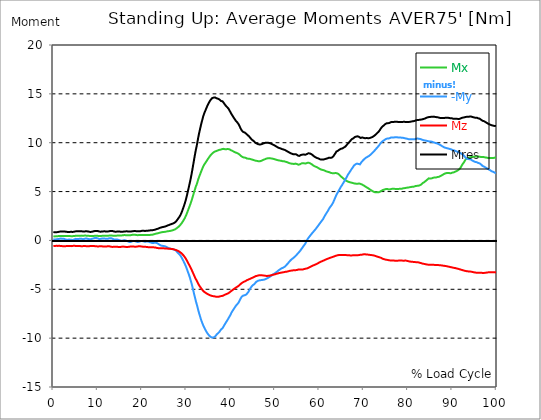
| Category |  Mx |  -My |  Mz |  Mres |
|---|---|---|---|---|
| 0.0 | 0.423 | 0.114 | -0.584 | 0.858 |
| 0.167348456675344 | 0.412 | 0.103 | -0.572 | 0.847 |
| 0.334696913350688 | 0.412 | 0.092 | -0.572 | 0.835 |
| 0.5020453700260321 | 0.412 | 0.103 | -0.561 | 0.835 |
| 0.669393826701376 | 0.423 | 0.114 | -0.549 | 0.835 |
| 0.83674228337672 | 0.435 | 0.137 | -0.549 | 0.847 |
| 1.0040907400520642 | 0.435 | 0.137 | -0.561 | 0.858 |
| 1.1621420602454444 | 0.446 | 0.137 | -0.549 | 0.87 |
| 1.3294905169207885 | 0.458 | 0.16 | -0.549 | 0.893 |
| 1.4968389735961325 | 0.458 | 0.172 | -0.561 | 0.904 |
| 1.6641874302714765 | 0.458 | 0.195 | -0.572 | 0.916 |
| 1.8315358869468206 | 0.458 | 0.183 | -0.584 | 0.927 |
| 1.9988843436221646 | 0.458 | 0.172 | -0.584 | 0.927 |
| 2.1662328002975086 | 0.458 | 0.172 | -0.584 | 0.927 |
| 2.333581256972853 | 0.458 | 0.172 | -0.584 | 0.916 |
| 2.5009297136481967 | 0.458 | 0.149 | -0.595 | 0.916 |
| 2.6682781703235405 | 0.446 | 0.114 | -0.595 | 0.904 |
| 2.8356266269988843 | 0.446 | 0.08 | -0.584 | 0.893 |
| 3.002975083674229 | 0.446 | 0.069 | -0.572 | 0.881 |
| 3.1703235403495724 | 0.446 | 0.069 | -0.561 | 0.87 |
| 3.337671997024917 | 0.446 | 0.08 | -0.561 | 0.858 |
| 3.4957233172182973 | 0.446 | 0.08 | -0.561 | 0.87 |
| 3.663071773893641 | 0.446 | 0.092 | -0.572 | 0.87 |
| 3.8304202305689854 | 0.446 | 0.08 | -0.584 | 0.881 |
| 3.997768687244329 | 0.435 | 0.069 | -0.584 | 0.881 |
| 4.165117143919673 | 0.435 | 0.046 | -0.572 | 0.881 |
| 4.332465600595017 | 0.435 | 0.046 | -0.561 | 0.87 |
| 4.499814057270361 | 0.446 | 0.057 | -0.549 | 0.881 |
| 4.667162513945706 | 0.458 | 0.092 | -0.549 | 0.893 |
| 4.834510970621049 | 0.469 | 0.137 | -0.549 | 0.916 |
| 5.001859427296393 | 0.469 | 0.16 | -0.561 | 0.927 |
| 5.169207883971737 | 0.469 | 0.16 | -0.572 | 0.938 |
| 5.336556340647081 | 0.469 | 0.149 | -0.584 | 0.938 |
| 5.503904797322425 | 0.469 | 0.149 | -0.584 | 0.938 |
| 5.671253253997769 | 0.469 | 0.137 | -0.572 | 0.927 |
| 5.82930457419115 | 0.469 | 0.149 | -0.572 | 0.916 |
| 5.996653030866494 | 0.481 | 0.183 | -0.572 | 0.927 |
| 6.164001487541838 | 0.492 | 0.195 | -0.584 | 0.938 |
| 6.331349944217181 | 0.492 | 0.172 | -0.595 | 0.938 |
| 6.498698400892526 | 0.481 | 0.137 | -0.595 | 0.927 |
| 6.66604685756787 | 0.481 | 0.126 | -0.584 | 0.916 |
| 6.833395314243213 | 0.481 | 0.137 | -0.572 | 0.916 |
| 7.000743770918558 | 0.492 | 0.16 | -0.572 | 0.916 |
| 7.168092227593902 | 0.492 | 0.195 | -0.572 | 0.927 |
| 7.335440684269246 | 0.492 | 0.206 | -0.584 | 0.938 |
| 7.50278914094459 | 0.492 | 0.206 | -0.595 | 0.938 |
| 7.6701375976199335 | 0.481 | 0.172 | -0.595 | 0.927 |
| 7.837486054295278 | 0.481 | 0.149 | -0.595 | 0.904 |
| 7.995537374488658 | 0.469 | 0.137 | -0.595 | 0.904 |
| 8.162885831164003 | 0.458 | 0.126 | -0.584 | 0.881 |
| 8.330234287839346 | 0.458 | 0.114 | -0.572 | 0.87 |
| 8.49758274451469 | 0.458 | 0.137 | -0.572 | 0.881 |
| 8.664931201190035 | 0.458 | 0.16 | -0.561 | 0.881 |
| 8.832279657865378 | 0.458 | 0.172 | -0.572 | 0.904 |
| 8.999628114540721 | 0.458 | 0.195 | -0.572 | 0.927 |
| 9.166976571216066 | 0.469 | 0.229 | -0.572 | 0.938 |
| 9.334325027891412 | 0.469 | 0.252 | -0.584 | 0.961 |
| 9.501673484566755 | 0.469 | 0.252 | -0.595 | 0.973 |
| 9.669021941242098 | 0.481 | 0.252 | -0.595 | 0.973 |
| 9.836370397917442 | 0.481 | 0.24 | -0.607 | 0.973 |
| 10.003718854592787 | 0.469 | 0.206 | -0.618 | 0.961 |
| 10.17106731126813 | 0.458 | 0.172 | -0.607 | 0.938 |
| 10.329118631461512 | 0.446 | 0.149 | -0.607 | 0.916 |
| 10.496467088136853 | 0.446 | 0.149 | -0.595 | 0.904 |
| 10.663815544812199 | 0.458 | 0.16 | -0.595 | 0.893 |
| 10.831164001487544 | 0.458 | 0.172 | -0.595 | 0.904 |
| 10.998512458162887 | 0.469 | 0.195 | -0.607 | 0.916 |
| 11.16586091483823 | 0.469 | 0.195 | -0.607 | 0.927 |
| 11.333209371513574 | 0.469 | 0.195 | -0.618 | 0.927 |
| 11.50055782818892 | 0.481 | 0.183 | -0.618 | 0.927 |
| 11.667906284864264 | 0.481 | 0.183 | -0.618 | 0.927 |
| 11.835254741539607 | 0.481 | 0.172 | -0.618 | 0.927 |
| 12.00260319821495 | 0.469 | 0.16 | -0.618 | 0.916 |
| 12.169951654890292 | 0.469 | 0.16 | -0.607 | 0.916 |
| 12.337300111565641 | 0.481 | 0.183 | -0.595 | 0.916 |
| 12.504648568240984 | 0.492 | 0.206 | -0.607 | 0.938 |
| 12.662699888434362 | 0.504 | 0.229 | -0.607 | 0.95 |
| 12.830048345109708 | 0.504 | 0.24 | -0.629 | 0.961 |
| 12.997396801785053 | 0.504 | 0.229 | -0.641 | 0.973 |
| 13.164745258460396 | 0.504 | 0.206 | -0.652 | 0.973 |
| 13.33209371513574 | 0.492 | 0.172 | -0.664 | 0.961 |
| 13.499442171811083 | 0.481 | 0.126 | -0.664 | 0.938 |
| 13.666790628486426 | 0.481 | 0.103 | -0.652 | 0.916 |
| 13.834139085161771 | 0.481 | 0.103 | -0.652 | 0.904 |
| 14.001487541837117 | 0.481 | 0.103 | -0.641 | 0.893 |
| 14.16883599851246 | 0.492 | 0.103 | -0.652 | 0.893 |
| 14.336184455187803 | 0.492 | 0.103 | -0.652 | 0.904 |
| 14.503532911863147 | 0.504 | 0.08 | -0.664 | 0.904 |
| 14.670881368538492 | 0.504 | 0.057 | -0.664 | 0.904 |
| 14.828932688731873 | 0.504 | 0.034 | -0.664 | 0.904 |
| 14.996281145407215 | 0.504 | 0.011 | -0.675 | 0.904 |
| 15.163629602082558 | 0.504 | -0.011 | -0.664 | 0.893 |
| 15.330978058757903 | 0.504 | -0.034 | -0.652 | 0.881 |
| 15.498326515433247 | 0.515 | -0.034 | -0.641 | 0.881 |
| 15.665674972108594 | 0.526 | -0.023 | -0.629 | 0.893 |
| 15.833023428783937 | 0.538 | 0 | -0.629 | 0.904 |
| 16.00037188545928 | 0.549 | 0.023 | -0.641 | 0.916 |
| 16.167720342134626 | 0.538 | 0.011 | -0.652 | 0.927 |
| 16.335068798809967 | 0.538 | -0.011 | -0.664 | 0.927 |
| 16.502417255485312 | 0.526 | -0.046 | -0.664 | 0.927 |
| 16.669765712160658 | 0.526 | -0.057 | -0.675 | 0.927 |
| 16.837114168836 | 0.526 | -0.103 | -0.664 | 0.927 |
| 17.004462625511344 | 0.526 | -0.137 | -0.652 | 0.916 |
| 17.16251394570472 | 0.526 | -0.16 | -0.641 | 0.916 |
| 17.32986240238007 | 0.526 | -0.172 | -0.629 | 0.916 |
| 17.497210859055414 | 0.538 | -0.149 | -0.618 | 0.916 |
| 17.664559315730756 | 0.561 | -0.114 | -0.618 | 0.927 |
| 17.8319077724061 | 0.572 | -0.08 | -0.618 | 0.938 |
| 17.999256229081443 | 0.584 | -0.046 | -0.618 | 0.95 |
| 18.166604685756788 | 0.584 | -0.046 | -0.629 | 0.95 |
| 18.333953142432133 | 0.584 | -0.057 | -0.641 | 0.961 |
| 18.501301599107478 | 0.572 | -0.08 | -0.641 | 0.961 |
| 18.668650055782823 | 0.561 | -0.114 | -0.641 | 0.95 |
| 18.835998512458165 | 0.549 | -0.137 | -0.629 | 0.938 |
| 19.00334696913351 | 0.538 | -0.16 | -0.618 | 0.927 |
| 19.170695425808855 | 0.538 | -0.16 | -0.595 | 0.927 |
| 19.338043882484197 | 0.549 | -0.137 | -0.595 | 0.927 |
| 19.496095202677576 | 0.549 | -0.103 | -0.595 | 0.938 |
| 19.66344365935292 | 0.561 | -0.069 | -0.607 | 0.95 |
| 19.830792116028263 | 0.561 | -0.046 | -0.618 | 0.961 |
| 19.998140572703612 | 0.561 | -0.057 | -0.629 | 0.984 |
| 20.165489029378953 | 0.561 | -0.069 | -0.652 | 0.984 |
| 20.3328374860543 | 0.549 | -0.092 | -0.652 | 0.984 |
| 20.500185942729644 | 0.549 | -0.114 | -0.652 | 0.973 |
| 20.667534399404985 | 0.549 | -0.137 | -0.652 | 0.973 |
| 20.83488285608033 | 0.549 | -0.126 | -0.652 | 0.973 |
| 21.002231312755672 | 0.561 | -0.114 | -0.664 | 0.984 |
| 21.16957976943102 | 0.561 | -0.103 | -0.675 | 0.996 |
| 21.336928226106362 | 0.561 | -0.103 | -0.687 | 0.996 |
| 21.504276682781704 | 0.561 | -0.126 | -0.698 | 1.007 |
| 21.67162513945705 | 0.561 | -0.16 | -0.698 | 1.019 |
| 21.82967645965043 | 0.572 | -0.183 | -0.71 | 1.041 |
| 21.997024916325774 | 0.572 | -0.217 | -0.71 | 1.041 |
| 22.16437337300112 | 0.572 | -0.24 | -0.71 | 1.041 |
| 22.33172182967646 | 0.584 | -0.263 | -0.698 | 1.041 |
| 22.499070286351806 | 0.607 | -0.252 | -0.71 | 1.053 |
| 22.666418743027148 | 0.629 | -0.252 | -0.71 | 1.076 |
| 22.833767199702496 | 0.652 | -0.24 | -0.71 | 1.099 |
| 23.00111565637784 | 0.675 | -0.24 | -0.721 | 1.11 |
| 23.168464113053183 | 0.698 | -0.24 | -0.744 | 1.133 |
| 23.335812569728528 | 0.71 | -0.263 | -0.767 | 1.167 |
| 23.50316102640387 | 0.732 | -0.298 | -0.778 | 1.19 |
| 23.670509483079215 | 0.744 | -0.355 | -0.79 | 1.213 |
| 23.83785793975456 | 0.767 | -0.423 | -0.801 | 1.247 |
| 23.995909259947936 | 0.79 | -0.458 | -0.801 | 1.282 |
| 24.163257716623285 | 0.813 | -0.504 | -0.813 | 1.316 |
| 24.330606173298627 | 0.824 | -0.526 | -0.813 | 1.328 |
| 24.49795462997397 | 0.835 | -0.538 | -0.813 | 1.35 |
| 24.665303086649313 | 0.858 | -0.561 | -0.813 | 1.373 |
| 24.83265154332466 | 0.858 | -0.572 | -0.813 | 1.385 |
| 25.0 | 0.87 | -0.584 | -0.813 | 1.396 |
| 25.167348456675345 | 0.881 | -0.607 | -0.824 | 1.419 |
| 25.334696913350694 | 0.893 | -0.629 | -0.824 | 1.442 |
| 25.502045370026035 | 0.916 | -0.687 | -0.835 | 1.488 |
| 25.669393826701377 | 0.927 | -0.71 | -0.835 | 1.511 |
| 25.836742283376722 | 0.938 | -0.744 | -0.847 | 1.545 |
| 26.004090740052067 | 0.95 | -0.778 | -0.847 | 1.568 |
| 26.17143919672741 | 0.961 | -0.801 | -0.858 | 1.602 |
| 26.329490516920792 | 0.973 | -0.835 | -0.858 | 1.625 |
| 26.49683897359613 | 0.996 | -0.858 | -0.87 | 1.648 |
| 26.66418743027148 | 1.007 | -0.87 | -0.87 | 1.682 |
| 26.831535886946828 | 1.03 | -0.881 | -0.881 | 1.705 |
| 26.998884343622166 | 1.053 | -0.904 | -0.893 | 1.728 |
| 27.166232800297514 | 1.076 | -0.927 | -0.916 | 1.762 |
| 27.333581256972852 | 1.11 | -0.95 | -0.938 | 1.808 |
| 27.5009297136482 | 1.133 | -0.973 | -0.95 | 1.854 |
| 27.668278170323543 | 1.19 | -1.041 | -0.984 | 1.934 |
| 27.835626626998888 | 1.259 | -1.133 | -1.019 | 2.037 |
| 28.002975083674233 | 1.316 | -1.225 | -1.041 | 2.14 |
| 28.170323540349575 | 1.373 | -1.305 | -1.087 | 2.243 |
| 28.33767199702492 | 1.431 | -1.373 | -1.122 | 2.335 |
| 28.50502045370026 | 1.511 | -1.465 | -1.167 | 2.461 |
| 28.663071773893645 | 1.602 | -1.556 | -1.225 | 2.598 |
| 28.830420230568986 | 1.682 | -1.671 | -1.293 | 2.758 |
| 28.99776868724433 | 1.797 | -1.808 | -1.362 | 2.941 |
| 29.165117143919673 | 1.911 | -1.957 | -1.453 | 3.159 |
| 29.33246560059502 | 2.037 | -2.094 | -1.522 | 3.365 |
| 29.499814057270367 | 2.163 | -2.255 | -1.614 | 3.582 |
| 29.66716251394571 | 2.3 | -2.415 | -1.717 | 3.822 |
| 29.834510970621054 | 2.461 | -2.586 | -1.831 | 4.074 |
| 30.00185942729639 | 2.632 | -2.781 | -1.968 | 4.372 |
| 30.169207883971744 | 2.815 | -2.976 | -2.094 | 4.669 |
| 30.33655634064708 | 3.021 | -3.204 | -2.255 | 5.013 |
| 30.50390479732243 | 3.227 | -3.399 | -2.392 | 5.333 |
| 30.671253253997772 | 3.422 | -3.616 | -2.529 | 5.677 |
| 30.829304574191156 | 3.628 | -3.845 | -2.678 | 6.008 |
| 30.996653030866494 | 3.834 | -4.131 | -2.827 | 6.386 |
| 31.164001487541842 | 4.063 | -4.383 | -2.987 | 6.764 |
| 31.331349944217187 | 4.303 | -4.681 | -3.147 | 7.176 |
| 31.498698400892525 | 4.566 | -5.001 | -3.319 | 7.622 |
| 31.666046857567874 | 4.818 | -5.322 | -3.491 | 8.057 |
| 31.833395314243212 | 5.081 | -5.642 | -3.662 | 8.503 |
| 32.00074377091856 | 5.31 | -5.94 | -3.834 | 8.915 |
| 32.1680922275939 | 5.551 | -6.26 | -3.983 | 9.327 |
| 32.33544068426925 | 5.722 | -6.512 | -4.109 | 9.659 |
| 32.50278914094459 | 5.974 | -6.798 | -4.257 | 10.071 |
| 32.670137597619934 | 6.226 | -7.096 | -4.418 | 10.483 |
| 32.83748605429528 | 6.443 | -7.382 | -4.555 | 10.872 |
| 33.004834510970625 | 6.649 | -7.634 | -4.681 | 11.216 |
| 33.162885831164004 | 6.844 | -7.885 | -4.784 | 11.548 |
| 33.33023428783935 | 7.05 | -8.137 | -4.898 | 11.879 |
| 33.497582744514695 | 7.222 | -8.332 | -4.99 | 12.166 |
| 33.664931201190036 | 7.416 | -8.538 | -5.093 | 12.463 |
| 33.83227965786538 | 7.599 | -8.721 | -5.184 | 12.738 |
| 33.99962811454073 | 7.737 | -8.881 | -5.253 | 12.967 |
| 34.16697657121607 | 7.851 | -9.041 | -5.31 | 13.15 |
| 34.33432502789141 | 7.965 | -9.179 | -5.356 | 13.333 |
| 34.50167348456676 | 8.08 | -9.316 | -5.402 | 13.516 |
| 34.6690219412421 | 8.194 | -9.442 | -5.459 | 13.699 |
| 34.83637039791744 | 8.32 | -9.556 | -5.493 | 13.859 |
| 35.00371885459279 | 8.423 | -9.659 | -5.539 | 14.02 |
| 35.17106731126814 | 8.538 | -9.751 | -5.574 | 14.157 |
| 35.338415767943474 | 8.641 | -9.819 | -5.608 | 14.283 |
| 35.49646708813686 | 8.732 | -9.877 | -5.642 | 14.397 |
| 35.6638155448122 | 8.824 | -9.922 | -5.665 | 14.489 |
| 35.831164001487544 | 8.904 | -9.945 | -5.688 | 14.569 |
| 35.998512458162885 | 8.961 | -9.945 | -5.699 | 14.603 |
| 36.165860914838234 | 9.018 | -9.911 | -5.711 | 14.615 |
| 36.333209371513576 | 9.076 | -9.888 | -5.722 | 14.638 |
| 36.50055782818892 | 9.11 | -9.831 | -5.722 | 14.626 |
| 36.667906284864266 | 9.133 | -9.739 | -5.757 | 14.592 |
| 36.83525474153961 | 9.156 | -9.625 | -5.768 | 14.546 |
| 37.002603198214956 | 9.19 | -9.545 | -5.768 | 14.512 |
| 37.1699516548903 | 9.224 | -9.488 | -5.768 | 14.5 |
| 37.337300111565646 | 9.259 | -9.407 | -5.757 | 14.466 |
| 37.50464856824098 | 9.282 | -9.327 | -5.745 | 14.42 |
| 37.66269988843437 | 9.282 | -9.213 | -5.711 | 14.329 |
| 37.83004834510971 | 9.304 | -9.11 | -5.688 | 14.271 |
| 37.99739680178505 | 9.339 | -9.041 | -5.688 | 14.26 |
| 38.16474525846039 | 9.373 | -8.984 | -5.665 | 14.237 |
| 38.33209371513574 | 9.373 | -8.892 | -5.642 | 14.168 |
| 38.49944217181109 | 9.35 | -8.721 | -5.596 | 14.031 |
| 38.666790628486424 | 9.339 | -8.595 | -5.562 | 13.928 |
| 38.83413908516178 | 9.339 | -8.469 | -5.528 | 13.825 |
| 39.001487541837115 | 9.339 | -8.343 | -5.493 | 13.733 |
| 39.16883599851246 | 9.35 | -8.229 | -5.459 | 13.653 |
| 39.336184455187805 | 9.35 | -8.103 | -5.436 | 13.573 |
| 39.503532911863154 | 9.362 | -7.977 | -5.402 | 13.493 |
| 39.670881368538495 | 9.339 | -7.84 | -5.345 | 13.367 |
| 39.83822982521384 | 9.282 | -7.714 | -5.276 | 13.218 |
| 39.996281145407224 | 9.247 | -7.565 | -5.219 | 13.081 |
| 40.163629602082565 | 9.213 | -7.405 | -5.161 | 12.944 |
| 40.33097805875791 | 9.179 | -7.279 | -5.104 | 12.818 |
| 40.498326515433256 | 9.144 | -7.153 | -5.047 | 12.703 |
| 40.6656749721086 | 9.098 | -7.038 | -4.99 | 12.578 |
| 40.83302342878393 | 9.064 | -6.924 | -4.944 | 12.463 |
| 41.00037188545929 | 9.018 | -6.81 | -4.887 | 12.349 |
| 41.16772034213463 | 8.984 | -6.695 | -4.841 | 12.246 |
| 41.33506879880997 | 8.961 | -6.604 | -4.784 | 12.154 |
| 41.50241725548531 | 8.927 | -6.523 | -4.738 | 12.074 |
| 41.66976571216066 | 8.892 | -6.443 | -4.692 | 11.982 |
| 41.837114168836 | 8.858 | -6.329 | -4.635 | 11.868 |
| 42.004462625511344 | 8.789 | -6.157 | -4.566 | 11.696 |
| 42.17181108218669 | 8.721 | -6.008 | -4.486 | 11.536 |
| 42.32986240238007 | 8.641 | -5.883 | -4.418 | 11.387 |
| 42.497210859055414 | 8.572 | -5.757 | -4.349 | 11.25 |
| 42.66455931573076 | 8.538 | -5.711 | -4.315 | 11.193 |
| 42.831907772406105 | 8.492 | -5.642 | -4.257 | 11.101 |
| 42.999256229081446 | 8.48 | -5.608 | -4.223 | 11.055 |
| 43.16660468575679 | 8.48 | -5.608 | -4.189 | 11.044 |
| 43.33395314243214 | 8.469 | -5.596 | -4.166 | 11.021 |
| 43.50130159910748 | 8.4 | -5.539 | -4.097 | 10.918 |
| 43.66865005578282 | 8.377 | -5.459 | -4.063 | 10.838 |
| 43.83599851245817 | 8.366 | -5.368 | -4.028 | 10.781 |
| 44.00334696913351 | 8.366 | -5.264 | -4.006 | 10.724 |
| 44.17069542580886 | 8.366 | -5.127 | -3.983 | 10.643 |
| 44.3380438824842 | 8.343 | -4.99 | -3.937 | 10.54 |
| 44.49609520267758 | 8.32 | -4.852 | -3.903 | 10.449 |
| 44.66344365935292 | 8.297 | -4.749 | -3.868 | 10.369 |
| 44.83079211602827 | 8.274 | -4.658 | -3.834 | 10.3 |
| 44.99814057270361 | 8.252 | -4.578 | -3.8 | 10.231 |
| 45.16548902937895 | 8.217 | -4.509 | -3.765 | 10.163 |
| 45.332837486054295 | 8.206 | -4.475 | -3.731 | 10.117 |
| 45.500185942729644 | 8.149 | -4.372 | -3.674 | 10.014 |
| 45.66753439940499 | 8.149 | -4.28 | -3.651 | 9.968 |
| 45.83488285608033 | 8.137 | -4.212 | -3.628 | 9.934 |
| 46.00223131275568 | 8.137 | -4.154 | -3.616 | 9.888 |
| 46.16957976943102 | 8.103 | -4.131 | -3.594 | 9.854 |
| 46.336928226106366 | 8.091 | -4.097 | -3.571 | 9.831 |
| 46.50427668278171 | 8.103 | -4.086 | -3.559 | 9.819 |
| 46.671625139457056 | 8.114 | -4.074 | -3.559 | 9.831 |
| 46.829676459650436 | 8.126 | -4.063 | -3.559 | 9.831 |
| 46.99702491632577 | 8.16 | -4.051 | -3.571 | 9.865 |
| 47.16437337300112 | 8.194 | -4.04 | -3.571 | 9.888 |
| 47.33172182967646 | 8.24 | -4.028 | -3.582 | 9.922 |
| 47.49907028635181 | 8.263 | -4.017 | -3.594 | 9.945 |
| 47.66641874302716 | 8.297 | -3.994 | -3.605 | 9.968 |
| 47.83376719970249 | 8.343 | -3.971 | -3.616 | 9.991 |
| 48.001115656377834 | 8.366 | -3.937 | -3.628 | 10.003 |
| 48.16846411305319 | 8.389 | -3.891 | -3.628 | 10.003 |
| 48.33581256972853 | 8.4 | -3.845 | -3.628 | 9.991 |
| 48.50316102640387 | 8.412 | -3.811 | -3.616 | 9.991 |
| 48.67050948307921 | 8.423 | -3.765 | -3.616 | 9.98 |
| 48.837857939754564 | 8.423 | -3.719 | -3.605 | 9.957 |
| 49.005206396429905 | 8.4 | -3.674 | -3.582 | 9.922 |
| 49.163257716623285 | 8.389 | -3.616 | -3.559 | 9.888 |
| 49.33060617329863 | 8.377 | -3.548 | -3.536 | 9.842 |
| 49.49795462997397 | 8.366 | -3.491 | -3.525 | 9.808 |
| 49.66530308664932 | 8.343 | -3.445 | -3.502 | 9.774 |
| 49.832651543324666 | 8.32 | -3.41 | -3.479 | 9.739 |
| 50.0 | 8.297 | -3.353 | -3.468 | 9.694 |
| 50.16734845667534 | 8.274 | -3.296 | -3.445 | 9.648 |
| 50.33469691335069 | 8.252 | -3.25 | -3.41 | 9.602 |
| 50.50204537002604 | 8.229 | -3.182 | -3.399 | 9.556 |
| 50.66939382670139 | 8.206 | -3.113 | -3.376 | 9.51 |
| 50.836742283376715 | 8.183 | -3.056 | -3.353 | 9.476 |
| 51.00409074005207 | 8.171 | -2.998 | -3.33 | 9.442 |
| 51.17143919672741 | 8.171 | -2.953 | -3.319 | 9.43 |
| 51.32949051692079 | 8.16 | -2.907 | -3.307 | 9.396 |
| 51.496838973596134 | 8.137 | -2.85 | -3.285 | 9.362 |
| 51.66418743027148 | 8.114 | -2.804 | -3.273 | 9.339 |
| 51.831535886946824 | 8.103 | -2.792 | -3.262 | 9.316 |
| 51.99888434362217 | 8.114 | -2.747 | -3.25 | 9.304 |
| 52.16623280029752 | 8.091 | -2.701 | -3.239 | 9.27 |
| 52.33358125697285 | 8.057 | -2.632 | -3.216 | 9.213 |
| 52.5009297136482 | 8.046 | -2.552 | -3.204 | 9.19 |
| 52.668278170323546 | 8.023 | -2.461 | -3.193 | 9.156 |
| 52.835626626998895 | 7.988 | -2.392 | -3.182 | 9.098 |
| 53.00297508367424 | 7.954 | -2.3 | -3.159 | 9.053 |
| 53.17032354034958 | 7.931 | -2.209 | -3.136 | 9.018 |
| 53.33767199702492 | 7.897 | -2.117 | -3.113 | 8.961 |
| 53.50502045370027 | 7.874 | -2.037 | -3.101 | 8.927 |
| 53.663071773893655 | 7.862 | -1.968 | -3.09 | 8.892 |
| 53.83042023056899 | 7.851 | -1.9 | -3.079 | 8.87 |
| 53.99776868724433 | 7.84 | -1.831 | -3.067 | 8.847 |
| 54.16511714391967 | 7.817 | -1.785 | -3.056 | 8.812 |
| 54.33246560059503 | 7.828 | -1.728 | -3.044 | 8.812 |
| 54.49981405727037 | 7.851 | -1.648 | -3.044 | 8.824 |
| 54.667162513945705 | 7.862 | -1.579 | -3.044 | 8.824 |
| 54.834510970621054 | 7.84 | -1.499 | -3.033 | 8.801 |
| 55.0018594272964 | 7.805 | -1.408 | -3.021 | 8.744 |
| 55.169207883971744 | 7.771 | -1.328 | -2.998 | 8.686 |
| 55.336556340647086 | 7.748 | -1.247 | -2.964 | 8.652 |
| 55.50390479732243 | 7.759 | -1.156 | -2.964 | 8.652 |
| 55.671253253997776 | 7.805 | -1.064 | -2.964 | 8.686 |
| 55.83860171067312 | 7.851 | -0.973 | -2.976 | 8.744 |
| 55.9966530308665 | 7.885 | -0.858 | -2.976 | 8.778 |
| 56.16400148754184 | 7.897 | -0.755 | -2.976 | 8.778 |
| 56.33134994421718 | 7.908 | -0.641 | -2.964 | 8.801 |
| 56.498698400892536 | 7.908 | -0.538 | -2.941 | 8.801 |
| 56.66604685756788 | 7.885 | -0.435 | -2.918 | 8.778 |
| 56.83339531424321 | 7.874 | -0.332 | -2.907 | 8.767 |
| 57.00074377091856 | 7.885 | -0.183 | -2.884 | 8.801 |
| 57.16809222759391 | 7.908 | -0.034 | -2.861 | 8.835 |
| 57.33544068426925 | 7.943 | 0.114 | -2.85 | 8.892 |
| 57.5027891409446 | 7.943 | 0.229 | -2.815 | 8.915 |
| 57.670137597619934 | 7.943 | 0.332 | -2.77 | 8.915 |
| 57.83748605429528 | 7.908 | 0.423 | -2.747 | 8.904 |
| 58.004834510970625 | 7.874 | 0.526 | -2.701 | 8.87 |
| 58.16288583116401 | 7.828 | 0.629 | -2.655 | 8.835 |
| 58.330234287839346 | 7.782 | 0.71 | -2.621 | 8.778 |
| 58.497582744514695 | 7.725 | 0.801 | -2.586 | 8.732 |
| 58.66493120119004 | 7.656 | 0.893 | -2.552 | 8.652 |
| 58.832279657865385 | 7.611 | 0.984 | -2.506 | 8.595 |
| 58.999628114540734 | 7.576 | 1.064 | -2.483 | 8.549 |
| 59.16697657121607 | 7.542 | 1.156 | -2.449 | 8.503 |
| 59.33432502789142 | 7.519 | 1.247 | -2.426 | 8.469 |
| 59.50167348456676 | 7.485 | 1.362 | -2.392 | 8.435 |
| 59.66902194124211 | 7.439 | 1.465 | -2.346 | 8.412 |
| 59.83637039791745 | 7.393 | 1.568 | -2.3 | 8.377 |
| 60.00371885459278 | 7.347 | 1.671 | -2.255 | 8.332 |
| 60.17106731126813 | 7.313 | 1.762 | -2.22 | 8.297 |
| 60.33841576794349 | 7.267 | 1.877 | -2.174 | 8.263 |
| 60.49646708813685 | 7.244 | 1.98 | -2.14 | 8.274 |
| 60.6638155448122 | 7.222 | 2.071 | -2.117 | 8.274 |
| 60.831164001487544 | 7.21 | 2.174 | -2.083 | 8.274 |
| 60.99851245816289 | 7.187 | 2.312 | -2.049 | 8.297 |
| 61.16586091483824 | 7.153 | 2.461 | -2.014 | 8.309 |
| 61.333209371513576 | 7.119 | 2.598 | -1.98 | 8.332 |
| 61.50055782818892 | 7.073 | 2.712 | -1.946 | 8.355 |
| 61.667906284864266 | 7.05 | 2.838 | -1.911 | 8.389 |
| 61.835254741539615 | 7.038 | 2.953 | -1.877 | 8.4 |
| 62.002603198214956 | 7.016 | 3.067 | -1.854 | 8.423 |
| 62.16995165489029 | 6.993 | 3.216 | -1.831 | 8.469 |
| 62.33730011156564 | 6.97 | 3.353 | -1.797 | 8.492 |
| 62.504648568240995 | 6.913 | 3.445 | -1.762 | 8.446 |
| 62.67199702491633 | 6.901 | 3.548 | -1.74 | 8.458 |
| 62.83004834510971 | 6.878 | 3.651 | -1.717 | 8.48 |
| 62.99739680178505 | 6.878 | 3.788 | -1.694 | 8.538 |
| 63.1647452584604 | 6.867 | 3.937 | -1.659 | 8.606 |
| 63.33209371513575 | 6.878 | 4.109 | -1.637 | 8.721 |
| 63.4994421718111 | 6.89 | 4.28 | -1.602 | 8.835 |
| 63.666790628486424 | 6.901 | 4.463 | -1.579 | 8.95 |
| 63.83413908516177 | 6.901 | 4.646 | -1.556 | 9.087 |
| 64.00148754183712 | 6.867 | 4.784 | -1.534 | 9.133 |
| 64.16883599851248 | 6.832 | 4.91 | -1.511 | 9.167 |
| 64.3361844551878 | 6.798 | 5.047 | -1.499 | 9.236 |
| 64.50353291186315 | 6.729 | 5.184 | -1.499 | 9.282 |
| 64.6708813685385 | 6.638 | 5.322 | -1.488 | 9.304 |
| 64.83822982521384 | 6.569 | 5.471 | -1.488 | 9.373 |
| 65.00557828188919 | 6.501 | 5.574 | -1.488 | 9.385 |
| 65.16362960208257 | 6.42 | 5.688 | -1.488 | 9.407 |
| 65.3309780587579 | 6.375 | 5.825 | -1.488 | 9.453 |
| 65.49832651543326 | 6.317 | 5.94 | -1.499 | 9.499 |
| 65.6656749721086 | 6.249 | 6.077 | -1.499 | 9.533 |
| 65.83302342878395 | 6.192 | 6.203 | -1.499 | 9.591 |
| 66.00037188545929 | 6.123 | 6.34 | -1.499 | 9.671 |
| 66.16772034213463 | 6.077 | 6.466 | -1.511 | 9.751 |
| 66.33506879880998 | 6.043 | 6.638 | -1.511 | 9.865 |
| 66.50241725548531 | 6.02 | 6.764 | -1.522 | 9.945 |
| 66.66976571216065 | 5.986 | 6.867 | -1.522 | 10.014 |
| 66.83711416883601 | 5.963 | 6.993 | -1.534 | 10.094 |
| 67.00446262551135 | 5.94 | 7.107 | -1.534 | 10.197 |
| 67.1718110821867 | 5.928 | 7.222 | -1.534 | 10.289 |
| 67.32986240238007 | 5.905 | 7.336 | -1.534 | 10.369 |
| 67.49721085905541 | 5.883 | 7.428 | -1.522 | 10.392 |
| 67.66455931573076 | 5.86 | 7.553 | -1.522 | 10.449 |
| 67.83190777240611 | 5.837 | 7.668 | -1.522 | 10.506 |
| 67.99925622908145 | 5.825 | 7.748 | -1.522 | 10.575 |
| 68.16660468575678 | 5.814 | 7.794 | -1.522 | 10.598 |
| 68.33395314243214 | 5.802 | 7.828 | -1.522 | 10.632 |
| 68.50130159910749 | 5.802 | 7.862 | -1.511 | 10.655 |
| 68.66865005578282 | 5.802 | 7.862 | -1.511 | 10.655 |
| 68.83599851245816 | 5.825 | 7.828 | -1.511 | 10.632 |
| 69.00334696913352 | 5.825 | 7.805 | -1.499 | 10.586 |
| 69.17069542580886 | 5.814 | 7.782 | -1.488 | 10.529 |
| 69.3380438824842 | 5.78 | 7.874 | -1.453 | 10.483 |
| 69.50539233915956 | 5.745 | 8.011 | -1.442 | 10.518 |
| 69.66344365935292 | 5.711 | 8.091 | -1.453 | 10.54 |
| 69.83079211602826 | 5.677 | 8.183 | -1.431 | 10.518 |
| 69.99814057270362 | 5.631 | 8.252 | -1.419 | 10.495 |
| 70.16548902937896 | 5.585 | 8.332 | -1.408 | 10.483 |
| 70.33283748605429 | 5.528 | 8.4 | -1.419 | 10.46 |
| 70.50018594272964 | 5.482 | 8.458 | -1.431 | 10.472 |
| 70.667534399405 | 5.436 | 8.515 | -1.442 | 10.483 |
| 70.83488285608033 | 5.39 | 8.549 | -1.453 | 10.472 |
| 71.00223131275568 | 5.345 | 8.595 | -1.453 | 10.46 |
| 71.16957976943102 | 5.299 | 8.629 | -1.465 | 10.46 |
| 71.33692822610637 | 5.242 | 8.675 | -1.476 | 10.472 |
| 71.50427668278171 | 5.184 | 8.755 | -1.488 | 10.495 |
| 71.67162513945706 | 5.139 | 8.835 | -1.499 | 10.529 |
| 71.8389735961324 | 5.093 | 8.904 | -1.499 | 10.552 |
| 71.99702491632577 | 5.047 | 8.973 | -1.511 | 10.586 |
| 72.16437337300113 | 5.001 | 9.041 | -1.534 | 10.632 |
| 72.33172182967647 | 4.967 | 9.133 | -1.545 | 10.689 |
| 72.49907028635181 | 4.944 | 9.213 | -1.568 | 10.746 |
| 72.66641874302715 | 4.921 | 9.293 | -1.591 | 10.815 |
| 72.8337671997025 | 4.91 | 9.385 | -1.614 | 10.884 |
| 73.00111565637783 | 4.921 | 9.476 | -1.648 | 10.964 |
| 73.16846411305319 | 4.921 | 9.556 | -1.671 | 11.033 |
| 73.33581256972853 | 4.921 | 9.636 | -1.694 | 11.101 |
| 73.50316102640387 | 4.944 | 9.739 | -1.705 | 11.204 |
| 73.67050948307921 | 4.978 | 9.854 | -1.74 | 11.307 |
| 73.83785793975457 | 5.047 | 9.957 | -1.785 | 11.433 |
| 74.00520639642991 | 5.081 | 10.037 | -1.797 | 11.525 |
| 74.16325771662328 | 5.127 | 10.117 | -1.854 | 11.628 |
| 74.33060617329863 | 5.161 | 10.174 | -1.888 | 11.708 |
| 74.49795462997398 | 5.173 | 10.22 | -1.911 | 11.754 |
| 74.66530308664932 | 5.207 | 10.277 | -1.923 | 11.834 |
| 74.83265154332466 | 5.242 | 10.323 | -1.946 | 11.891 |
| 75.00000000000001 | 5.253 | 10.357 | -1.968 | 11.925 |
| 75.16734845667534 | 5.264 | 10.415 | -1.98 | 11.982 |
| 75.3346969133507 | 5.264 | 10.426 | -1.991 | 11.994 |
| 75.50204537002605 | 5.23 | 10.426 | -2.014 | 11.994 |
| 75.66939382670138 | 5.219 | 10.437 | -2.026 | 11.994 |
| 75.83674228337672 | 5.23 | 10.46 | -2.037 | 12.028 |
| 76.00409074005208 | 5.23 | 10.495 | -2.049 | 12.063 |
| 76.17143919672742 | 5.253 | 10.529 | -2.049 | 12.108 |
| 76.33878765340276 | 5.276 | 10.552 | -2.049 | 12.131 |
| 76.49683897359614 | 5.287 | 10.54 | -2.049 | 12.131 |
| 76.66418743027148 | 5.299 | 10.529 | -2.049 | 12.131 |
| 76.83153588694682 | 5.287 | 10.54 | -2.06 | 12.131 |
| 76.99888434362218 | 5.276 | 10.552 | -2.071 | 12.143 |
| 77.16623280029752 | 5.276 | 10.563 | -2.071 | 12.143 |
| 77.33358125697285 | 5.264 | 10.563 | -2.071 | 12.143 |
| 77.5009297136482 | 5.264 | 10.563 | -2.071 | 12.143 |
| 77.66827817032356 | 5.264 | 10.54 | -2.071 | 12.131 |
| 77.83562662699889 | 5.276 | 10.529 | -2.06 | 12.12 |
| 78.00297508367423 | 5.276 | 10.529 | -2.06 | 12.131 |
| 78.17032354034959 | 5.287 | 10.54 | -2.06 | 12.131 |
| 78.33767199702493 | 5.299 | 10.518 | -2.049 | 12.131 |
| 78.50502045370027 | 5.299 | 10.518 | -2.049 | 12.12 |
| 78.67236891037561 | 5.299 | 10.518 | -2.06 | 12.131 |
| 78.83042023056899 | 5.31 | 10.506 | -2.071 | 12.131 |
| 78.99776868724433 | 5.345 | 10.495 | -2.083 | 12.143 |
| 79.16511714391969 | 5.356 | 10.472 | -2.094 | 12.143 |
| 79.33246560059503 | 5.356 | 10.46 | -2.06 | 12.12 |
| 79.49981405727036 | 5.368 | 10.437 | -2.06 | 12.12 |
| 79.66716251394571 | 5.39 | 10.415 | -2.071 | 12.12 |
| 79.83451097062107 | 5.402 | 10.403 | -2.094 | 12.131 |
| 80.00185942729641 | 5.413 | 10.38 | -2.117 | 12.131 |
| 80.16920788397174 | 5.425 | 10.357 | -2.14 | 12.12 |
| 80.33655634064709 | 5.436 | 10.346 | -2.152 | 12.131 |
| 80.50390479732243 | 5.436 | 10.346 | -2.152 | 12.143 |
| 80.67125325399778 | 5.471 | 10.346 | -2.174 | 12.154 |
| 80.83860171067312 | 5.482 | 10.357 | -2.186 | 12.177 |
| 80.99665303086651 | 5.493 | 10.369 | -2.186 | 12.2 |
| 81.16400148754184 | 5.493 | 10.357 | -2.197 | 12.2 |
| 81.3313499442172 | 5.505 | 10.357 | -2.209 | 12.211 |
| 81.49869840089255 | 5.539 | 10.357 | -2.22 | 12.234 |
| 81.66604685756786 | 5.562 | 10.38 | -2.22 | 12.269 |
| 81.83339531424322 | 5.574 | 10.403 | -2.232 | 12.291 |
| 82.00074377091858 | 5.585 | 10.415 | -2.232 | 12.314 |
| 82.16809222759392 | 5.585 | 10.426 | -2.232 | 12.326 |
| 82.33544068426926 | 5.596 | 10.415 | -2.243 | 12.326 |
| 82.50278914094459 | 5.619 | 10.403 | -2.266 | 12.337 |
| 82.67013759761994 | 5.642 | 10.392 | -2.289 | 12.36 |
| 82.83748605429528 | 5.688 | 10.369 | -2.312 | 12.36 |
| 83.00483451097062 | 5.722 | 10.346 | -2.323 | 12.36 |
| 83.17218296764597 | 5.791 | 10.312 | -2.346 | 12.383 |
| 83.33023428783935 | 5.871 | 10.277 | -2.38 | 12.406 |
| 83.4975827445147 | 5.917 | 10.254 | -2.392 | 12.429 |
| 83.66493120119004 | 5.963 | 10.266 | -2.403 | 12.475 |
| 83.83227965786537 | 5.997 | 10.231 | -2.426 | 12.475 |
| 83.99962811454073 | 6.089 | 10.209 | -2.438 | 12.509 |
| 84.16697657121607 | 6.157 | 10.197 | -2.449 | 12.555 |
| 84.33432502789142 | 6.214 | 10.186 | -2.472 | 12.578 |
| 84.50167348456677 | 6.283 | 10.163 | -2.483 | 12.6 |
| 84.6690219412421 | 6.352 | 10.14 | -2.483 | 12.635 |
| 84.83637039791745 | 6.352 | 10.128 | -2.483 | 12.635 |
| 85.0037188545928 | 6.329 | 10.128 | -2.483 | 12.635 |
| 85.17106731126813 | 6.329 | 10.128 | -2.483 | 12.646 |
| 85.33841576794349 | 6.352 | 10.117 | -2.483 | 12.658 |
| 85.50576422461883 | 6.375 | 10.083 | -2.483 | 12.658 |
| 85.66381554481221 | 6.409 | 10.06 | -2.483 | 12.669 |
| 85.83116400148755 | 6.443 | 10.025 | -2.495 | 12.669 |
| 85.99851245816289 | 6.443 | 10.003 | -2.506 | 12.646 |
| 86.16586091483823 | 6.443 | 9.98 | -2.518 | 12.635 |
| 86.33320937151358 | 6.443 | 9.957 | -2.518 | 12.623 |
| 86.50055782818893 | 6.466 | 9.934 | -2.518 | 12.612 |
| 86.66790628486427 | 6.489 | 9.922 | -2.518 | 12.612 |
| 86.83525474153961 | 6.501 | 9.877 | -2.529 | 12.589 |
| 87.00260319821496 | 6.512 | 9.831 | -2.529 | 12.555 |
| 87.16995165489031 | 6.546 | 9.797 | -2.541 | 12.543 |
| 87.33730011156564 | 6.592 | 9.751 | -2.541 | 12.543 |
| 87.504648568241 | 6.638 | 9.705 | -2.552 | 12.532 |
| 87.67199702491634 | 6.672 | 9.671 | -2.564 | 12.532 |
| 87.83004834510972 | 6.718 | 9.613 | -2.575 | 12.532 |
| 87.99739680178506 | 6.764 | 9.568 | -2.586 | 12.532 |
| 88.1647452584604 | 6.81 | 9.522 | -2.598 | 12.532 |
| 88.33209371513574 | 6.844 | 9.499 | -2.609 | 12.543 |
| 88.49944217181108 | 6.878 | 9.476 | -2.621 | 12.555 |
| 88.66679062848644 | 6.89 | 9.453 | -2.632 | 12.555 |
| 88.83413908516178 | 6.89 | 9.43 | -2.655 | 12.543 |
| 89.00148754183712 | 6.901 | 9.407 | -2.667 | 12.543 |
| 89.16883599851246 | 6.901 | 9.396 | -2.689 | 12.543 |
| 89.33618445518782 | 6.89 | 9.373 | -2.701 | 12.532 |
| 89.50353291186315 | 6.878 | 9.35 | -2.712 | 12.509 |
| 89.6708813685385 | 6.878 | 9.327 | -2.735 | 12.497 |
| 89.83822982521386 | 6.913 | 9.304 | -2.747 | 12.509 |
| 90.00557828188919 | 6.935 | 9.259 | -2.77 | 12.486 |
| 90.16362960208257 | 6.947 | 9.224 | -2.781 | 12.463 |
| 90.3309780587579 | 6.97 | 9.213 | -2.804 | 12.452 |
| 90.49832651543326 | 7.004 | 9.201 | -2.815 | 12.463 |
| 90.66567497210859 | 7.038 | 9.167 | -2.827 | 12.475 |
| 90.83302342878395 | 7.073 | 9.133 | -2.85 | 12.452 |
| 91.00037188545929 | 7.107 | 9.098 | -2.873 | 12.452 |
| 91.16772034213463 | 7.153 | 9.064 | -2.895 | 12.44 |
| 91.33506879880998 | 7.199 | 9.03 | -2.907 | 12.44 |
| 91.50241725548533 | 7.267 | 8.995 | -2.941 | 12.429 |
| 91.66976571216065 | 7.325 | 8.961 | -2.953 | 12.44 |
| 91.83711416883601 | 7.428 | 8.938 | -2.976 | 12.475 |
| 92.00446262551137 | 7.553 | 8.904 | -2.998 | 12.509 |
| 92.1718110821867 | 7.702 | 8.847 | -3.021 | 12.543 |
| 92.33915953886203 | 7.817 | 8.778 | -3.044 | 12.566 |
| 92.49721085905541 | 7.92 | 8.721 | -3.067 | 12.578 |
| 92.66455931573077 | 8.023 | 8.652 | -3.09 | 12.589 |
| 92.83190777240611 | 8.16 | 8.561 | -3.113 | 12.612 |
| 92.99925622908145 | 8.286 | 8.469 | -3.124 | 12.635 |
| 93.1666046857568 | 8.377 | 8.389 | -3.147 | 12.646 |
| 93.33395314243214 | 8.412 | 8.366 | -3.159 | 12.658 |
| 93.50130159910749 | 8.446 | 8.343 | -3.17 | 12.658 |
| 93.66865005578283 | 8.469 | 8.32 | -3.17 | 12.669 |
| 93.83599851245818 | 8.48 | 8.309 | -3.182 | 12.669 |
| 94.00334696913353 | 8.503 | 8.286 | -3.182 | 12.681 |
| 94.17069542580886 | 8.526 | 8.286 | -3.193 | 12.692 |
| 94.3380438824842 | 8.538 | 8.24 | -3.204 | 12.669 |
| 94.50539233915954 | 8.549 | 8.183 | -3.227 | 12.635 |
| 94.66344365935292 | 8.561 | 8.137 | -3.239 | 12.623 |
| 94.83079211602828 | 8.561 | 8.103 | -3.262 | 12.6 |
| 94.99814057270362 | 8.572 | 8.057 | -3.273 | 12.578 |
| 95.16548902937897 | 8.583 | 8.034 | -3.285 | 12.555 |
| 95.33283748605432 | 8.595 | 8.023 | -3.296 | 12.566 |
| 95.50018594272963 | 8.595 | 8.011 | -3.296 | 12.566 |
| 95.66753439940499 | 8.595 | 7.965 | -3.307 | 12.52 |
| 95.83488285608034 | 8.583 | 7.931 | -3.307 | 12.497 |
| 96.00223131275567 | 8.583 | 7.908 | -3.307 | 12.475 |
| 96.16957976943102 | 8.572 | 7.885 | -3.296 | 12.463 |
| 96.33692822610638 | 8.549 | 7.862 | -3.296 | 12.417 |
| 96.50427668278171 | 8.538 | 7.771 | -3.307 | 12.349 |
| 96.67162513945706 | 8.538 | 7.702 | -3.319 | 12.303 |
| 96.8389735961324 | 8.538 | 7.622 | -3.319 | 12.246 |
| 96.99702491632577 | 8.538 | 7.576 | -3.33 | 12.211 |
| 97.16437337300111 | 8.526 | 7.553 | -3.33 | 12.2 |
| 97.33172182967647 | 8.503 | 7.508 | -3.319 | 12.154 |
| 97.49907028635181 | 8.492 | 7.462 | -3.307 | 12.108 |
| 97.66641874302715 | 8.48 | 7.416 | -3.296 | 12.063 |
| 97.8337671997025 | 8.458 | 7.37 | -3.285 | 12.017 |
| 98.00111565637785 | 8.446 | 7.325 | -3.273 | 11.96 |
| 98.16846411305319 | 8.435 | 7.279 | -3.262 | 11.925 |
| 98.33581256972855 | 8.435 | 7.244 | -3.25 | 11.902 |
| 98.50316102640389 | 8.435 | 7.199 | -3.25 | 11.857 |
| 98.67050948307921 | 8.423 | 7.141 | -3.262 | 11.822 |
| 98.83785793975456 | 8.423 | 7.096 | -3.262 | 11.788 |
| 99.0052063964299 | 8.435 | 7.05 | -3.262 | 11.765 |
| 99.17255485310525 | 8.435 | 7.027 | -3.273 | 11.754 |
| 99.33060617329863 | 8.446 | 6.981 | -3.262 | 11.731 |
| 99.49795462997399 | 8.458 | 6.958 | -3.262 | 11.719 |
| 99.66530308664933 | 8.48 | 6.913 | -3.262 | 11.708 |
| 99.83265154332467 | 8.492 | 6.867 | -3.273 | 11.696 |
| 100.0 | 8.515 | 6.821 | -3.285 | 11.685 |